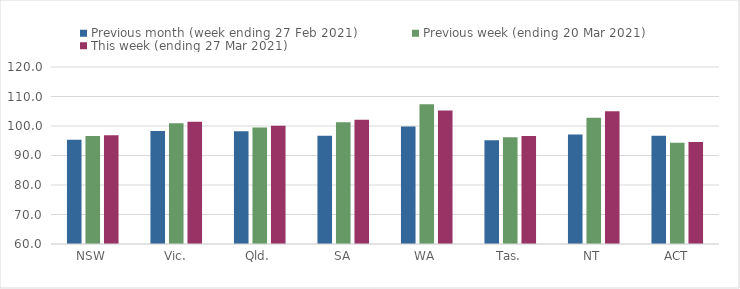
| Category | Previous month (week ending 27 Feb 2021) | Previous week (ending 20 Mar 2021) | This week (ending 27 Mar 2021) |
|---|---|---|---|
| NSW | 95.36 | 96.65 | 96.85 |
| Vic. | 98.33 | 100.92 | 101.48 |
| Qld. | 98.26 | 99.52 | 100.12 |
| SA | 96.72 | 101.23 | 102.09 |
| WA | 99.87 | 107.36 | 105.22 |
| Tas. | 95.21 | 96.19 | 96.63 |
| NT | 97.08 | 102.82 | 104.97 |
| ACT | 96.68 | 94.33 | 94.57 |